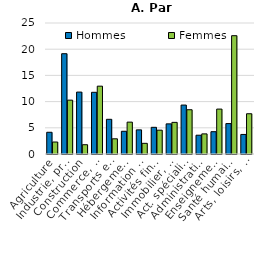
| Category | Hommes | Femmes |
|---|---|---|
| Agriculture | 4.148 | 2.285 |
| Industrie, prod. d'énergie | 19.14 | 10.278 |
| Construction | 11.817 | 1.772 |
| Commerce, réparation | 11.775 | 12.947 |
| Transports et entreposage | 6.62 | 2.899 |
| Hébergement et restauration | 4.336 | 6.082 |
| Information et communication | 4.605 | 2.035 |
| Activités financières et d'assurance | 5.09 | 4.545 |
| Immobilier, activités administratives | 5.75 | 6.038 |
| Act. spécialisées, scient. et techn. | 9.339 | 8.447 |
| Administration publique | 3.585 | 3.84 |
| Enseignement | 4.257 | 8.572 |
| Santé humaine et action sociale | 5.805 | 22.579 |
| Arts, loisirs, ménages privés, autres | 3.732 | 7.681 |